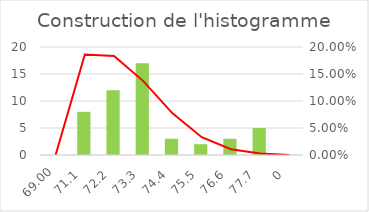
| Category | Effictif |
|---|---|
| 0 | 0 |
| 1 | 8 |
| 2 | 12 |
| 3 | 17 |
| 4 | 3 |
| 5 | 2 |
| 6 | 3 |
| 7 | 5 |
| 8 | 0 |